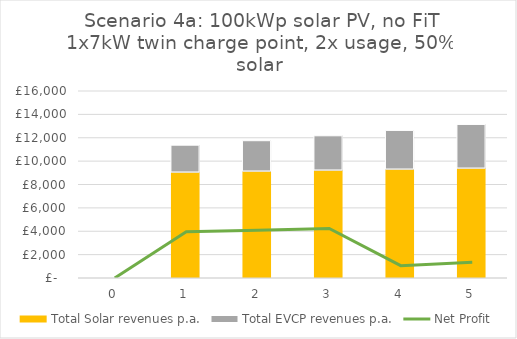
| Category | Total Solar revenues p.a. | Total EVCP revenues p.a. |
|---|---|---|
| 0.0 | 0 | 0 |
| 1.0 | 9030 | 2333.333 |
| 2.0 | 9115.81 | 2630.833 |
| 3.0 | 9200.734 | 2966.265 |
| 4.0 | 9284.517 | 3344.463 |
| 5.0 | 9366.879 | 3770.882 |